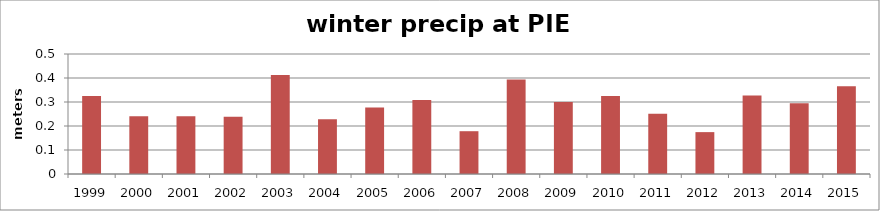
| Category | ttl winter precip |
|---|---|
| 1999.0 | 0.325 |
| 2000.0 | 0.24 |
| 2001.0 | 0.241 |
| 2002.0 | 0.239 |
| 2003.0 | 0.412 |
| 2004.0 | 0.228 |
| 2005.0 | 0.277 |
| 2006.0 | 0.308 |
| 2007.0 | 0.178 |
| 2008.0 | 0.394 |
| 2009.0 | 0.3 |
| 2010.0 | 0.325 |
| 2011.0 | 0.251 |
| 2012.0 | 0.174 |
| 2013.0 | 0.327 |
| 2014.0 | 0.295 |
| 2015.0 | 0.366 |